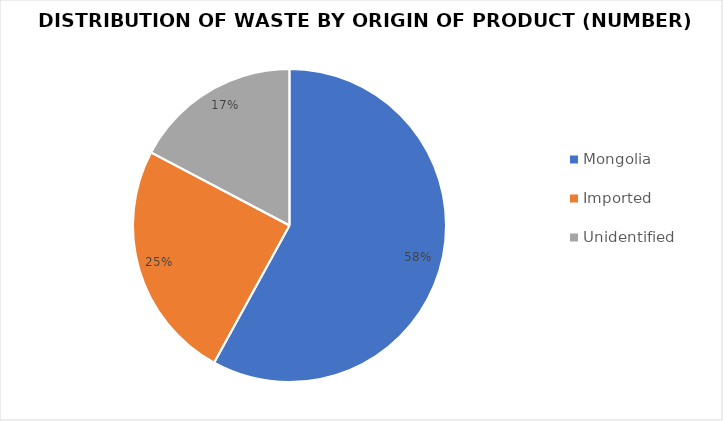
| Category | Series 0 |
|---|---|
| Mongolia | 11626 |
| Imported | 4958 |
| Unidentified | 3463 |